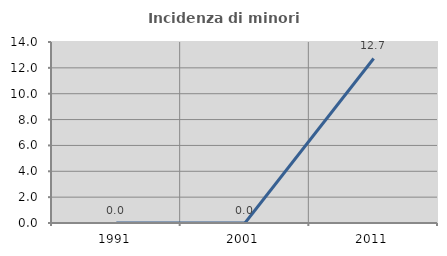
| Category | Incidenza di minori stranieri |
|---|---|
| 1991.0 | 0 |
| 2001.0 | 0 |
| 2011.0 | 12.727 |